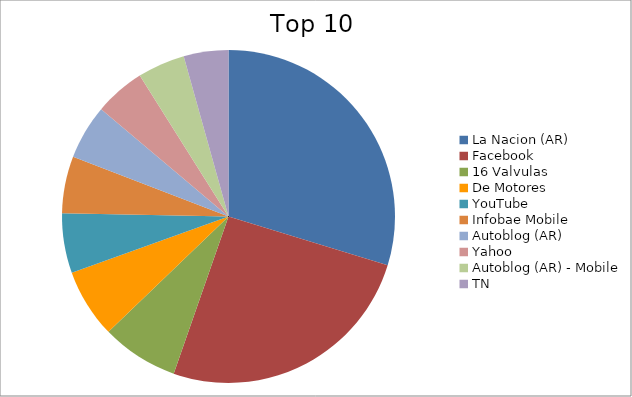
| Category | Series 0 |
|---|---|
| La Nacion (AR) | 15.43 |
| Facebook | 13.28 |
| 16 Valvulas | 3.88 |
| De Motores | 3.48 |
| YouTube | 3 |
| Infobae Mobile | 2.87 |
| Autoblog (AR) | 2.75 |
| Yahoo | 2.55 |
| Autoblog (AR) - Mobile | 2.39 |
| TN | 2.25 |